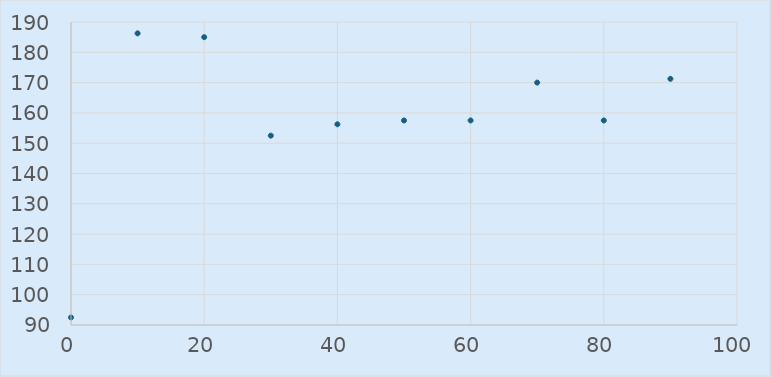
| Category | Series 0 |
|---|---|
| 0.0 | 92.5 |
| 10.0 | 186.25 |
| 20.0 | 185 |
| 30.0 | 152.5 |
| 40.0 | 156.25 |
| 50.0 | 157.5 |
| 60.0 | 157.5 |
| 70.0 | 170 |
| 80.0 | 157.5 |
| 90.0 | 171.25 |